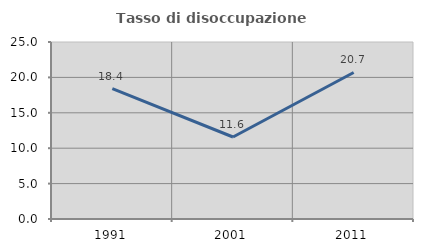
| Category | Tasso di disoccupazione giovanile  |
|---|---|
| 1991.0 | 18.416 |
| 2001.0 | 11.583 |
| 2011.0 | 20.699 |